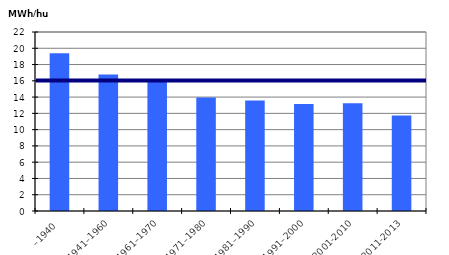
| Category | MWH/hus |
|---|---|
| –1940 | 19.382 |
| 1941–1960 | 16.786 |
| 1961–1970 | 16.165 |
| 1971–1980 | 13.945 |
| 1981–1990 | 13.596 |
| 1991–2000 | 13.159 |
| 2001-2010 | 13.258 |
| 2011-2013 | 11.733 |